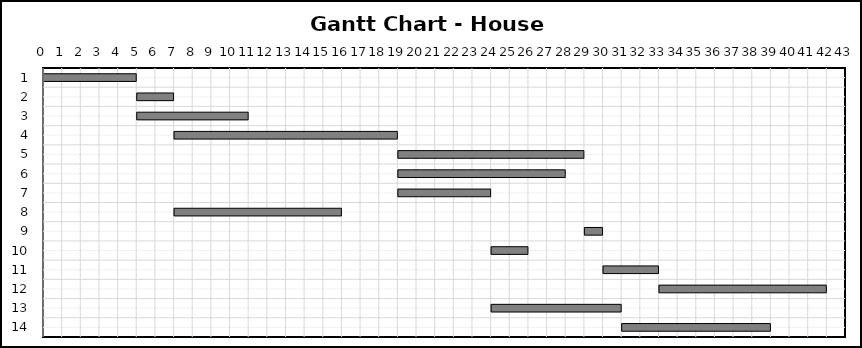
| Category | Series 0 | Series 1 |
|---|---|---|
| 0 | 0 | 5 |
| 1 | 5 | 2 |
| 2 | 5 | 6 |
| 3 | 7 | 12 |
| 4 | 19 | 10 |
| 5 | 19 | 9 |
| 6 | 19 | 5 |
| 7 | 7 | 9 |
| 8 | 29 | 1 |
| 9 | 24 | 2 |
| 10 | 30 | 3 |
| 11 | 33 | 9 |
| 12 | 24 | 7 |
| 13 | 31 | 8 |